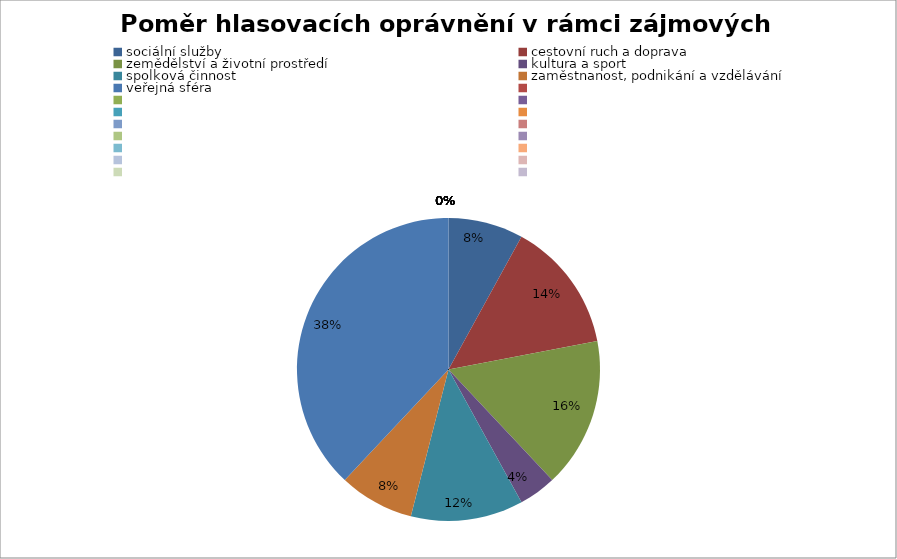
| Category | Series 0 |
|---|---|
| sociální služby | 0.08 |
| cestovní ruch a doprava | 0.14 |
| zemědělství a životní prostředí | 0.16 |
| kultura a sport | 0.04 |
| spolková činnost | 0.12 |
| zaměstnanost, podnikání a vzdělávání | 0.08 |
| veřejná sféra | 0.38 |